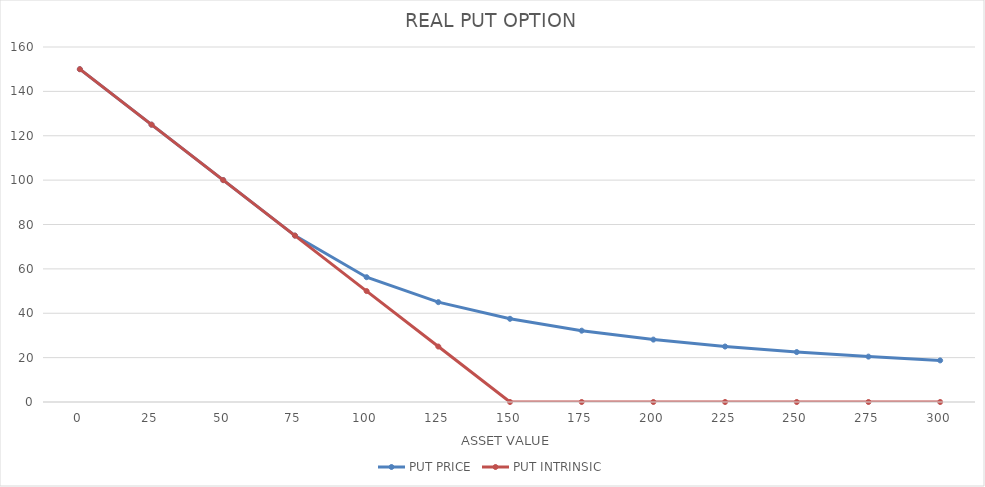
| Category | PUT PRICE | PUT INTRINSIC |
|---|---|---|
| 0.0 | 150 | 150 |
| 25.0 | 125 | 125 |
| 50.0 | 100 | 100 |
| 75.0 | 75 | 75 |
| 100.0 | 56.25 | 50 |
| 125.0 | 45 | 25 |
| 150.0 | 37.5 | 0 |
| 175.0 | 32.143 | 0 |
| 200.0 | 28.125 | 0 |
| 225.0 | 25 | 0 |
| 250.0 | 22.5 | 0 |
| 275.0 | 20.455 | 0 |
| 300.0 | 18.75 | 0 |